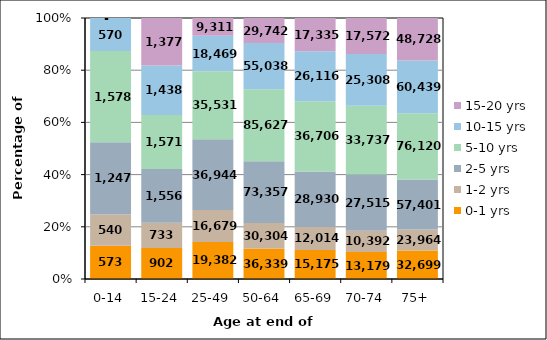
| Category | 0-1 yrs | 1-2 yrs | 2-5 yrs | 5-10 yrs | 10-15 yrs | 15-20 yrs |
|---|---|---|---|---|---|---|
| 0-14 | 573 | 540 | 1247 | 1578 | 570 | 0 |
| 15-24 | 902 | 733 | 1556 | 1571 | 1438 | 1377 |
| 25-49 | 19382 | 16679 | 36944 | 35531 | 18469 | 9311 |
| 50-64 | 36339 | 30304 | 73357 | 85627 | 55038 | 29742 |
| 65-69 | 15175 | 12014 | 28930 | 36706 | 26116 | 17335 |
| 70-74 | 13179 | 10392 | 27515 | 33737 | 25308 | 17572 |
| 75+ | 32699 | 23964 | 57401 | 76120 | 60439 | 48728 |